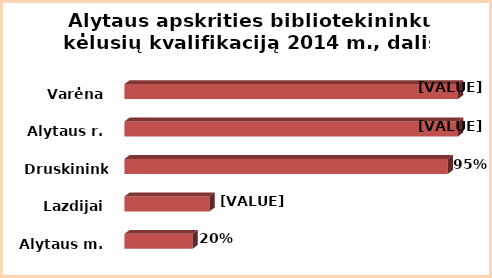
| Category | Series 0 |
|---|---|
| Alytaus m. | 20 |
| Lazdijai | 25 |
| Druskininkai | 95 |
| Alytaus r. | 98 |
| Varėna | 98 |